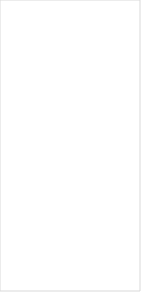
| Category | Asheville Jewish Community Center | Asheville Museum of Science (AMOS) | Asheville Waldorf School - Enrollment Modernization | Asheville Waldorf School - Kindergarten Access | Asheville-Buncombe Technical Community College | Bent Creek Preschool | Buncombe County Schools | Buncombe Partnership for Children - Systems Coordination | Buncombe Partnership for Children - Workforce Dev | Child Care Center of First Presbyterian | Community Action Opportunities - Burton PreK | Community Action Opportunities - Burton Toddler Care | Community Action Opportunities - Johnston PreK | Eliada Homes, Inc | Evolve Early Learning | F I R S T | Friends of Mine Preschool | Hominy Baptist Church | Irene Wortham Center | OnTrack Financial Education & Counseling | Read to Succeed | Southwestern Child Development | Sprouts Early Learning Academy | Swannanoa Valley Child Care Council (Donald S Collins Early Learning Center) | The Christine Avery Learning Center | Verner Center for Early Learning | YTL Training Program | YWCA of Asheville and Western North Carolina - Early Learning | YWCA of Asheville and Western North Carolina - Empowerment Childcare |
|---|---|---|---|---|---|---|---|---|---|---|---|---|---|---|---|---|---|---|---|---|---|---|---|---|---|---|---|---|---|
| Total | 0.821 | 0.709 | 0.575 | 0.593 | 0.877 | 0.724 | 0.869 | 0.895 | 0.901 | 0.746 | 0.915 | 0.9 | 0.929 | 0.906 | 0.789 | 0.909 | 0.757 | 0.813 | 0.876 | 0.893 | 0.876 | 0.741 | 0.736 | 0.857 | 0.868 | 0.869 | 0.604 | 0.854 | 0.867 |